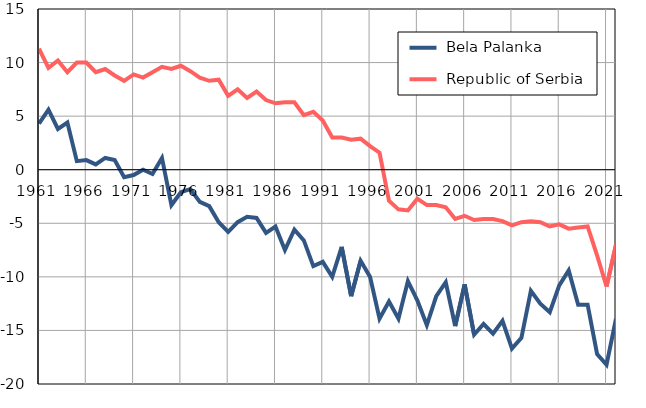
| Category |  Bela Palanka |  Republic of Serbia |
|---|---|---|
| 1961.0 | 4.3 | 11.3 |
| 1962.0 | 5.6 | 9.5 |
| 1963.0 | 3.8 | 10.2 |
| 1964.0 | 4.4 | 9.1 |
| 1965.0 | 0.8 | 10 |
| 1966.0 | 0.9 | 10 |
| 1967.0 | 0.5 | 9.1 |
| 1968.0 | 1.1 | 9.4 |
| 1969.0 | 0.9 | 8.8 |
| 1970.0 | -0.7 | 8.3 |
| 1971.0 | -0.5 | 8.9 |
| 1972.0 | 0 | 8.6 |
| 1973.0 | -0.4 | 9.1 |
| 1974.0 | 1.1 | 9.6 |
| 1975.0 | -3.3 | 9.4 |
| 1976.0 | -2.1 | 9.7 |
| 1977.0 | -1.8 | 9.2 |
| 1978.0 | -3 | 8.6 |
| 1979.0 | -3.4 | 8.3 |
| 1980.0 | -4.9 | 8.4 |
| 1981.0 | -5.8 | 6.9 |
| 1982.0 | -4.9 | 7.5 |
| 1983.0 | -4.4 | 6.7 |
| 1984.0 | -4.5 | 7.3 |
| 1985.0 | -5.9 | 6.5 |
| 1986.0 | -5.3 | 6.2 |
| 1987.0 | -7.5 | 6.3 |
| 1988.0 | -5.6 | 6.3 |
| 1989.0 | -6.6 | 5.1 |
| 1990.0 | -9 | 5.4 |
| 1991.0 | -8.6 | 4.6 |
| 1992.0 | -10 | 3 |
| 1993.0 | -7.2 | 3 |
| 1994.0 | -11.8 | 2.8 |
| 1995.0 | -8.5 | 2.9 |
| 1996.0 | -10 | 2.2 |
| 1997.0 | -13.9 | 1.6 |
| 1998.0 | -12.3 | -2.9 |
| 1999.0 | -13.9 | -3.7 |
| 2000.0 | -10.4 | -3.8 |
| 2001.0 | -12.2 | -2.7 |
| 2002.0 | -14.5 | -3.3 |
| 2003.0 | -11.8 | -3.3 |
| 2004.0 | -10.5 | -3.5 |
| 2005.0 | -14.6 | -4.6 |
| 2006.0 | -10.7 | -4.3 |
| 2007.0 | -15.4 | -4.7 |
| 2008.0 | -14.4 | -4.6 |
| 2009.0 | -15.3 | -4.6 |
| 2010.0 | -14.1 | -4.8 |
| 2011.0 | -16.7 | -5.2 |
| 2012.0 | -15.7 | -4.9 |
| 2013.0 | -11.3 | -4.8 |
| 2014.0 | -12.5 | -4.9 |
| 2015.0 | -13.3 | -5.3 |
| 2016.0 | -10.8 | -5.1 |
| 2017.0 | -9.4 | -5.5 |
| 2018.0 | -12.6 | -5.4 |
| 2019.0 | -12.6 | -5.3 |
| 2020.0 | -17.2 | -8 |
| 2021.0 | -18.2 | -10.9 |
| 2022.0 | -13.9 | -7 |